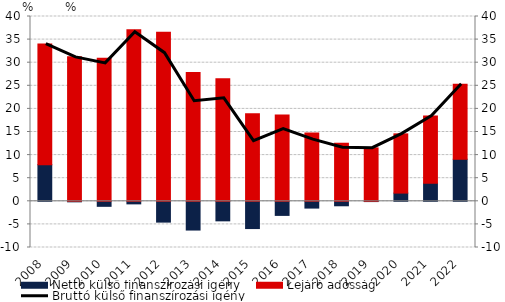
| Category | Nettó külső finanszírozási igény | Lejáró adósság |
|---|---|---|
| 2008.0 | 7.937 | 26.102 |
| 2009.0 | -0.115 | 31.264 |
| 2010.0 | -1.088 | 30.946 |
| 2011.0 | -0.558 | 37.14 |
| 2012.0 | -4.505 | 36.569 |
| 2013.0 | -6.224 | 27.885 |
| 2014.0 | -4.231 | 26.516 |
| 2015.0 | -5.901 | 18.943 |
| 2016.0 | -3.053 | 18.692 |
| 2017.0 | -1.469 | 14.806 |
| 2018.0 | -0.969 | 12.568 |
| 2019.0 | -0.061 | 11.558 |
| 2020.0 | 1.776 | 12.821 |
| 2021.0 | 3.911 | 14.533 |
| 2022.0 | 9.107 | 16.243 |